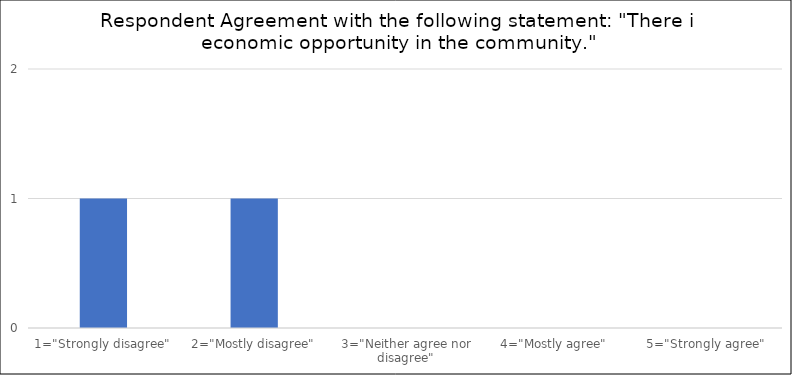
| Category | Number of Responses |
|---|---|
| 1="Strongly disagree" | 1 |
| 2="Mostly disagree" | 1 |
| 3="Neither agree nor disagree" | 0 |
| 4="Mostly agree" | 0 |
| 5="Strongly agree" | 0 |